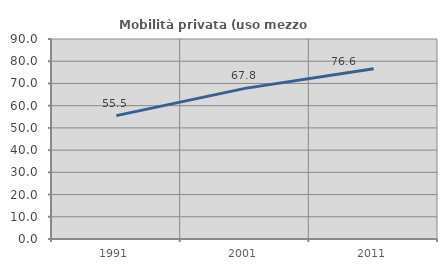
| Category | Mobilità privata (uso mezzo privato) |
|---|---|
| 1991.0 | 55.506 |
| 2001.0 | 67.774 |
| 2011.0 | 76.619 |